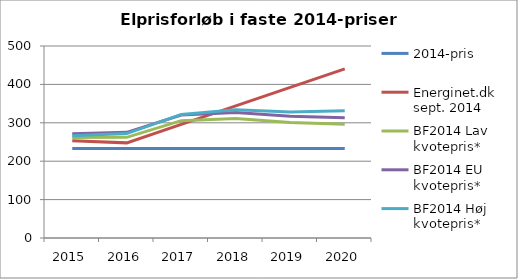
| Category | 2014-pris | Energinet.dk sept. 2014 | BF2014 Lav kvotepris* | BF2014 EU kvotepris* | BF2014 Høj kvotepris* |
|---|---|---|---|---|---|
| 2015.0 | 233.036 | 253.109 | 262.039 | 271.782 | 266.087 |
| 2016.0 | 233.036 | 247.744 | 262.176 | 275.079 | 271.865 |
| 2017.0 | 233.036 | 295.93 | 305.545 | 320.368 | 321.818 |
| 2018.0 | 233.036 | 344.115 | 311.063 | 326.945 | 333.954 |
| 2019.0 | 233.036 | 392.3 | 300.749 | 316.772 | 328.294 |
| 2020.0 | 233.036 | 440.485 | 296.301 | 313.339 | 331.202 |